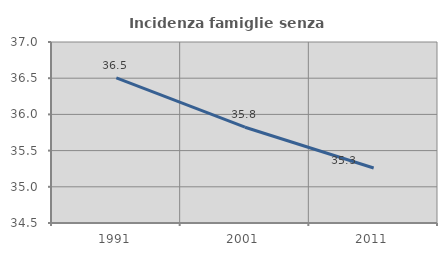
| Category | Incidenza famiglie senza nuclei |
|---|---|
| 1991.0 | 36.505 |
| 2001.0 | 35.823 |
| 2011.0 | 35.26 |